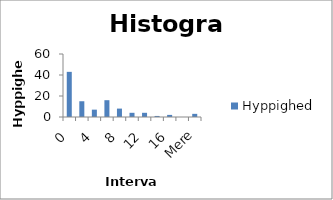
| Category | Hyppighed |
|---|---|
| 0 | 43 |
| 2 | 15 |
| 4 | 7 |
| 6 | 16 |
| 8 | 8 |
| 10 | 4 |
| 12 | 4 |
| 14 | 1 |
| 16 | 2 |
| 18 | 0 |
| Mere | 3 |